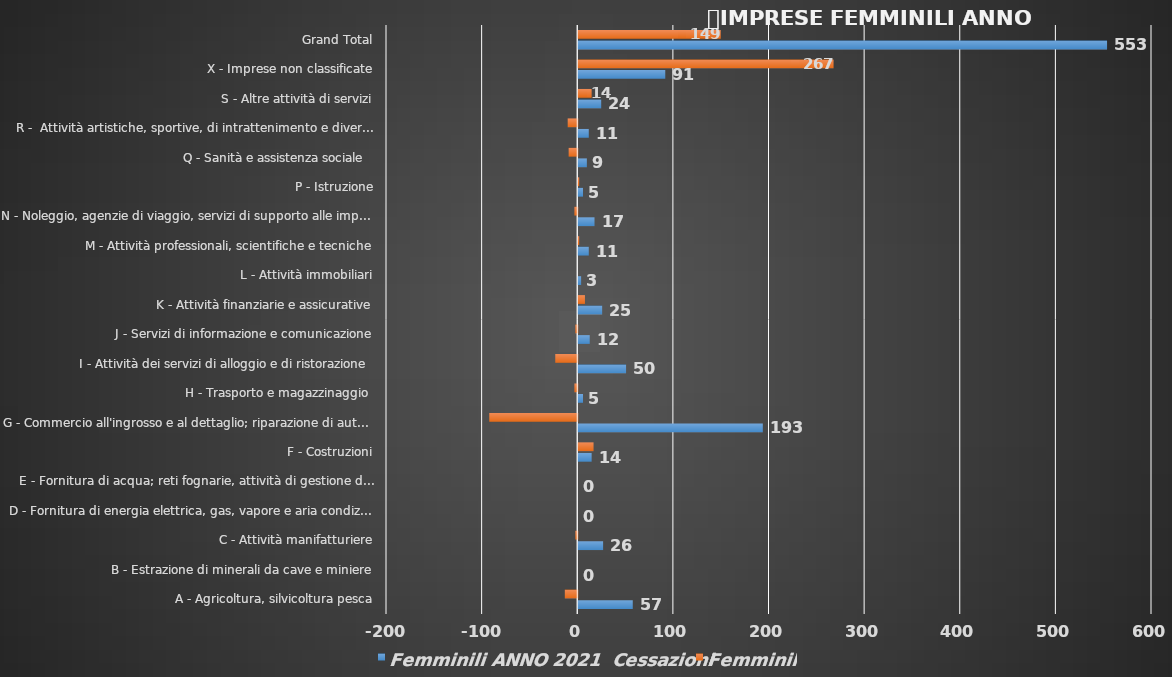
| Category | Femminili ANNO 2021 |
|---|---|
| A - Agricoltura, silvicoltura pesca | -13 |
| B - Estrazione di minerali da cave e miniere | 0 |
| C - Attività manifatturiere | -2 |
| D - Fornitura di energia elettrica, gas, vapore e aria condiz... | 0 |
| E - Fornitura di acqua; reti fognarie, attività di gestione d... | 0 |
| F - Costruzioni | 16 |
| G - Commercio all'ingrosso e al dettaglio; riparazione di aut... | -92 |
| H - Trasporto e magazzinaggio  | -3 |
| I - Attività dei servizi di alloggio e di ristorazione  | -23 |
| J - Servizi di informazione e comunicazione | -2 |
| K - Attività finanziarie e assicurative | 7 |
| L - Attività immobiliari | 0 |
| M - Attività professionali, scientifiche e tecniche | 1 |
| N - Noleggio, agenzie di viaggio, servizi di supporto alle imp... | -3 |
| P - Istruzione | 1 |
| Q - Sanità e assistenza sociale   | -9 |
| R -  Attività artistiche, sportive, di intrattenimento e diver... | -10 |
| S - Altre attività di servizi | 14 |
| X - Imprese non classificate | 267 |
| Grand Total | 149 |